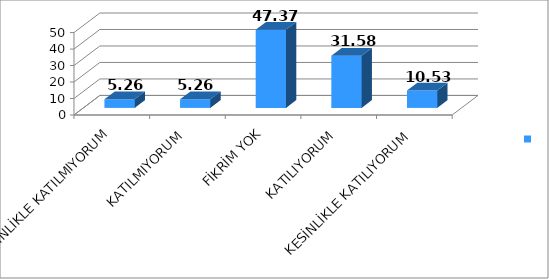
| Category | Series 0 |
|---|---|
| KESİNLİKLE KATILMIYORUM | 5.26 |
| KATILMIYORUM | 5.26 |
| FİKRİM YOK | 47.37 |
| KATILIYORUM | 31.58 |
| KESİNLİKLE KATILIYORUM | 10.53 |